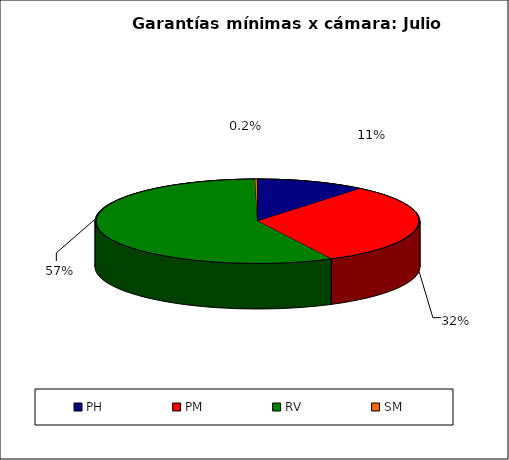
| Category | Series 0 |
|---|---|
| PH | 1703.874 |
| PM | 4913.79 |
| RV | 8910.127 |
| SM | 35.701 |